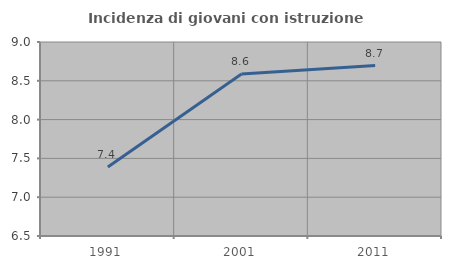
| Category | Incidenza di giovani con istruzione universitaria |
|---|---|
| 1991.0 | 7.389 |
| 2001.0 | 8.589 |
| 2011.0 | 8.696 |